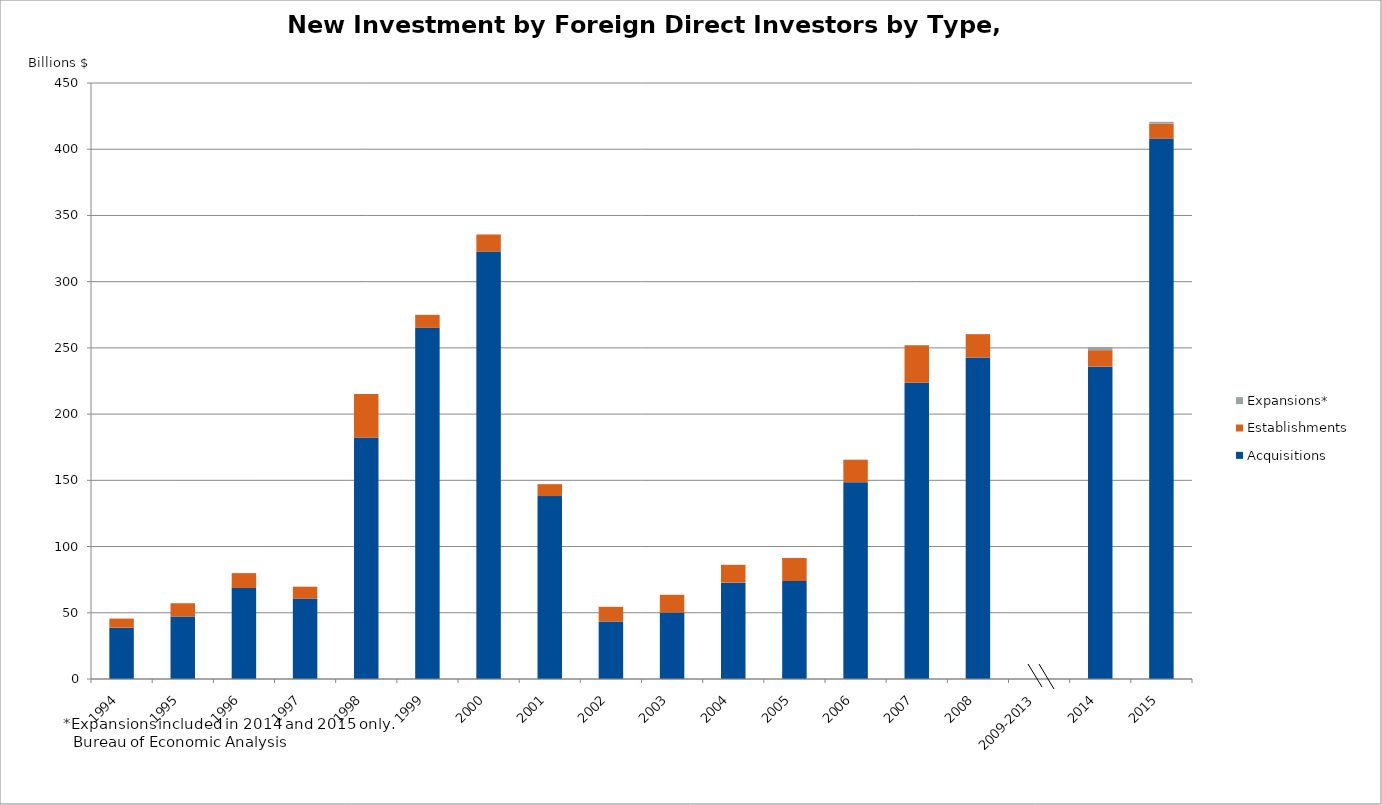
| Category | Acquisitions | Establishments | Expansions* |
|---|---|---|---|
| 1994 | 38.753 | 6.873 | 0 |
| 1995 | 47.179 | 10.016 | 0 |
| 1996 | 68.733 | 11.196 | 0 |
| 1997 | 60.733 | 8.974 | 0 |
| 1998 | 182.357 | 32.899 | 0 |
| 1999 | 265.127 | 9.829 | 0 |
| 2000 | 322.703 | 12.926 | 0 |
| 2001 | 138.091 | 9.017 | 0 |
| 2002 | 43.442 | 11.077 | 0 |
| 2003 | 50.212 | 13.379 | 0 |
| 2004 | 72.738 | 13.481 | 0 |
| 2005 | 73.997 | 17.393 | 0 |
| 2006 | 148.604 | 16.999 | 0 |
| 2007 | 223.616 | 28.301 | 0 |
| 2008 | 242.799 | 17.564 | 0 |
| 2009-2013 | 0 | 0 | 0 |
| 2014 | 235.799 | 12.473 | 2.309 |
| 2015 | 408.056 | 11.249 | 1.387 |